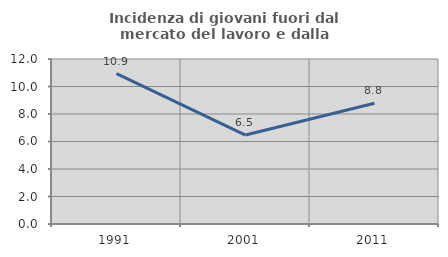
| Category | Incidenza di giovani fuori dal mercato del lavoro e dalla formazione  |
|---|---|
| 1991.0 | 10.941 |
| 2001.0 | 6.469 |
| 2011.0 | 8.782 |